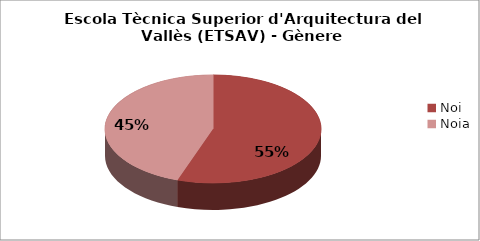
| Category | Escola Tècnica Superior d'Arquitectura del Vallès (ETSAV) - Gènere |
|---|---|
| Noi | 0.553 |
| Noia | 0.447 |